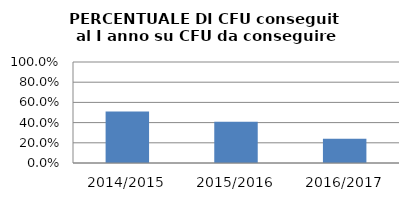
| Category | 2014/2015 2015/2016 2016/2017 |
|---|---|
| 2014/2015 | 0.51 |
| 2015/2016 | 0.407 |
| 2016/2017 | 0.239 |